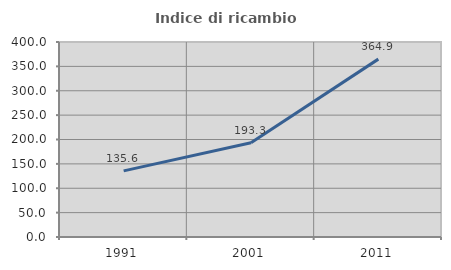
| Category | Indice di ricambio occupazionale  |
|---|---|
| 1991.0 | 135.616 |
| 2001.0 | 193.333 |
| 2011.0 | 364.865 |